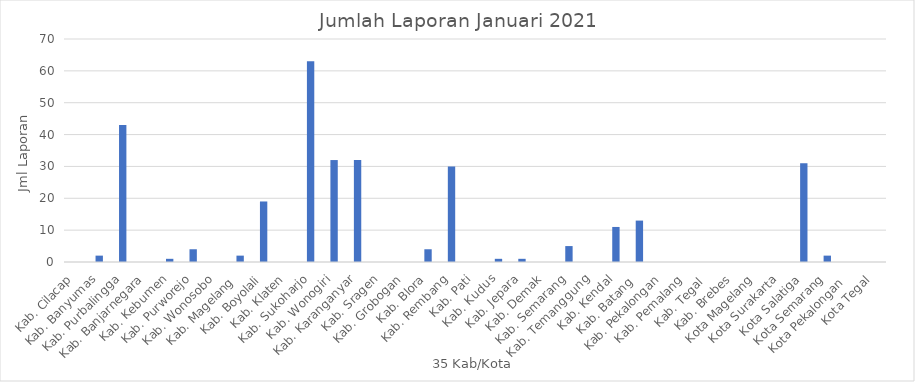
| Category | Series 0 |
|---|---|
| Kab. Cilacap | 0 |
| Kab. Banyumas | 2 |
| Kab. Purbalingga | 43 |
| Kab. Banjarnegara | 0 |
| Kab. Kebumen | 1 |
| Kab. Purworejo | 4 |
| Kab. Wonosobo | 0 |
| Kab. Magelang  | 2 |
| Kab. Boyolali | 19 |
| Kab. Klaten | 0 |
| Kab. Sukoharjo | 63 |
| Kab. Wonogiri | 32 |
| Kab. Karanganyar | 32 |
| Kab. Sragen | 0 |
| Kab. Grobogan | 0 |
| Kab. Blora | 4 |
| Kab. Rembang | 30 |
| Kab. Pati | 0 |
| Kab. Kudus | 1 |
| Kab. Jepara | 1 |
| Kab. Demak | 0 |
| Kab. Semarang | 5 |
| Kab. Temanggung | 0 |
| Kab. Kendal | 11 |
| Kab. Batang  | 13 |
| Kab. Pekalongan | 0 |
| Kab. Pemalang | 0 |
| Kab. Tegal  | 0 |
| Kab. Brebes | 0 |
| Kota Magelang | 0 |
| Kota Surakarta | 0 |
| Kota Salatiga | 31 |
| Kota Semarang | 2 |
| Kota Pekalongan  | 0 |
| Kota Tegal | 0 |